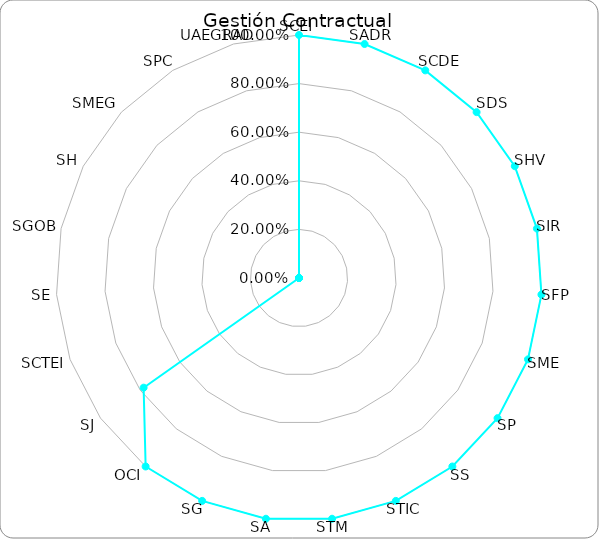
| Category | % Eficacia total |
|---|---|
| SCEI | 1 |
| SADR | 1 |
| SCDE | 1 |
| SDS | 1 |
| SHV | 1 |
| SIR | 1 |
| SFP | 1 |
| SME | 1 |
| SP | 1 |
| SS | 1 |
| STIC | 1 |
| STM | 1 |
| SA | 1 |
| SG | 1 |
| OCI | 1 |
| SJ | 0.783 |
| SCTEI | 0 |
| SE | 0 |
| SGOB | 0 |
| SH | 0 |
| SMEG | 0 |
| SPC | 0 |
| UAEGRAD | 0 |